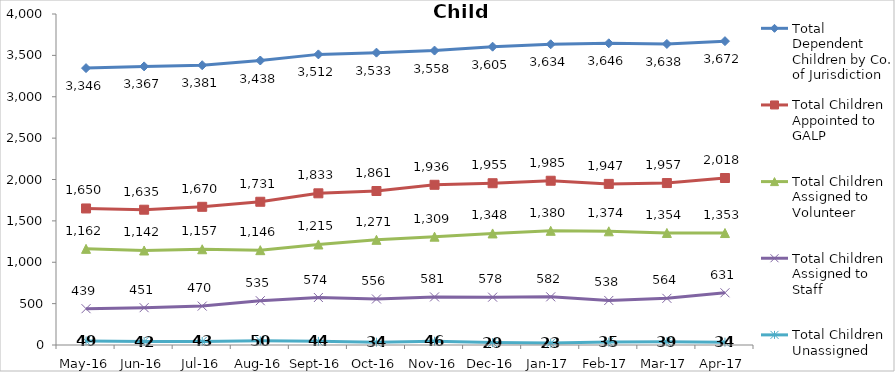
| Category | Total Dependent Children by Co. of Jurisdiction | Total Children Appointed to GALP | Total Children Assigned to Volunteer | Total Children Assigned to Staff | Total Children Unassigned |
|---|---|---|---|---|---|
| May-16 | 3346 | 1650 | 1162 | 439 | 49 |
| Jun-16 | 3367 | 1635 | 1142 | 451 | 42 |
| Jul-16 | 3381 | 1670 | 1157 | 470 | 43 |
| Aug-16 | 3438 | 1731 | 1146 | 535 | 50 |
| Sep-16 | 3512 | 1833 | 1215 | 574 | 44 |
| Oct-16 | 3533 | 1861 | 1271 | 556 | 34 |
| Nov-16 | 3558 | 1936 | 1309 | 581 | 46 |
| Dec-16 | 3605 | 1955 | 1348 | 578 | 29 |
| Jan-17 | 3634 | 1985 | 1380 | 582 | 23 |
| Feb-17 | 3646 | 1947 | 1374 | 538 | 35 |
| Mar-17 | 3638 | 1957 | 1354 | 564 | 39 |
| Apr-17 | 3672 | 2018 | 1353 | 631 | 34 |